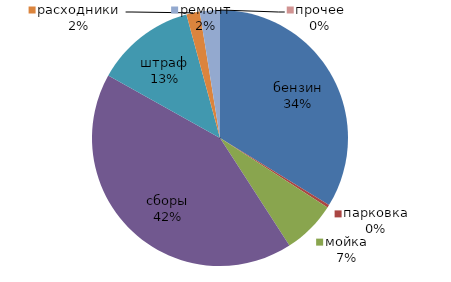
| Category | бензин парковка мойка сборы штраф расходники ремонт прочее |
|---|---|
| бензин | 4000 |
| парковка | 40 |
| мойка | 800 |
| сборы | 5000 |
| штраф | 1500 |
| расходники | 200 |
| ремонт | 300 |
| прочее | 0 |